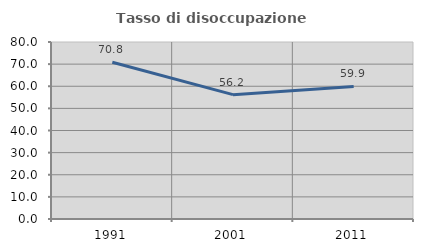
| Category | Tasso di disoccupazione giovanile  |
|---|---|
| 1991.0 | 70.828 |
| 2001.0 | 56.193 |
| 2011.0 | 59.892 |